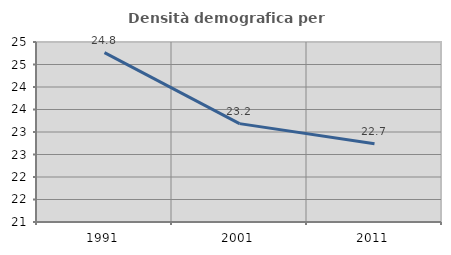
| Category | Densità demografica |
|---|---|
| 1991.0 | 24.764 |
| 2001.0 | 23.186 |
| 2011.0 | 22.741 |